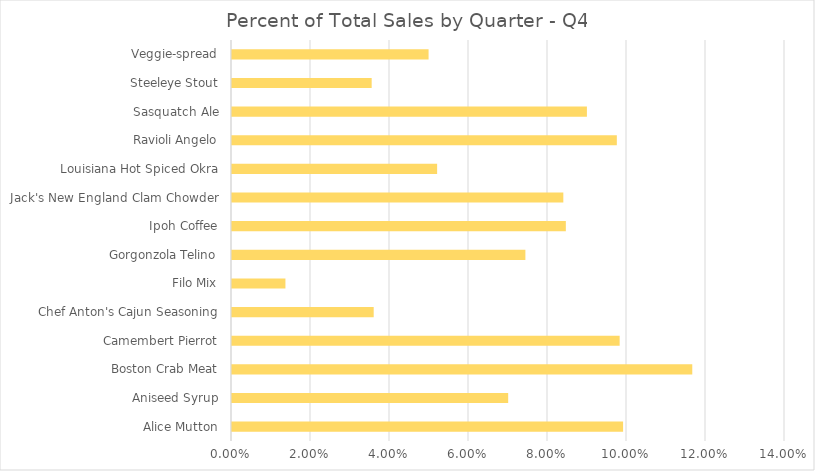
| Category | Percent of Q4 |
|---|---|
| Alice Mutton | 0.099 |
| Aniseed Syrup | 0.07 |
| Boston Crab Meat | 0.117 |
| Camembert Pierrot | 0.098 |
| Chef Anton's Cajun Seasoning | 0.036 |
| Filo Mix | 0.014 |
| Gorgonzola Telino | 0.074 |
| Ipoh Coffee | 0.085 |
| Jack's New England Clam Chowder | 0.084 |
| Louisiana Hot Spiced Okra | 0.052 |
| Ravioli Angelo | 0.097 |
| Sasquatch Ale | 0.09 |
| Steeleye Stout | 0.035 |
| Veggie-spread | 0.05 |